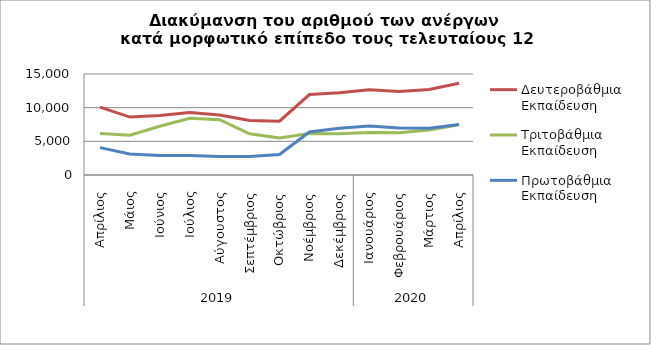
| Category | Δευτεροβάθμια Εκπαίδευση | Τριτοβάθμια Εκπαίδευση | Πρωτοβάθμια Εκπαίδευση |
|---|---|---|---|
| 0 | 10088 | 6160 | 4067 |
| 1 | 8603 | 5896 | 3108 |
| 2 | 8822 | 7231 | 2907 |
| 3 | 9270 | 8411 | 2901 |
| 4 | 8918 | 8210 | 2755 |
| 5 | 8096 | 6115 | 2757 |
| 6 | 7999 | 5505 | 3040 |
| 7 | 11945 | 6155 | 6395 |
| 8 | 12223 | 6111 | 6951 |
| 9 | 12645 | 6303 | 7266 |
| 10 | 12391 | 6258 | 6971 |
| 11 | 12702 | 6691 | 6960 |
| 12 | 13630 | 7456 | 7505 |